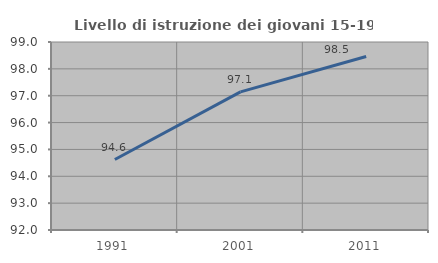
| Category | Livello di istruzione dei giovani 15-19 anni |
|---|---|
| 1991.0 | 94.624 |
| 2001.0 | 97.143 |
| 2011.0 | 98.462 |